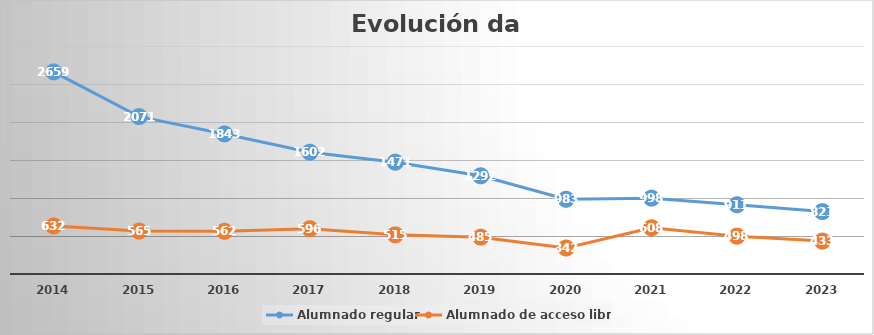
| Category | Alumnado regular | Alumnado de acceso libre |
|---|---|---|
| 2014 | 2659 | 632 |
| 2015 | 2071 | 565 |
| 2016 | 1843 | 562 |
| 2017 | 1602 | 596 |
| 2018 | 1471 | 515 |
| 2019 | 1292 | 485 |
| 2020 | 983 | 342 |
| 2021 | 998 | 608 |
| 2022 | 911 | 498 |
| 2023 | 821 | 433 |